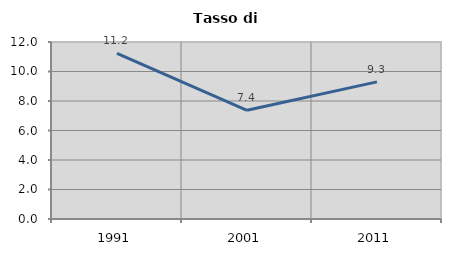
| Category | Tasso di disoccupazione   |
|---|---|
| 1991.0 | 11.23 |
| 2001.0 | 7.368 |
| 2011.0 | 9.297 |